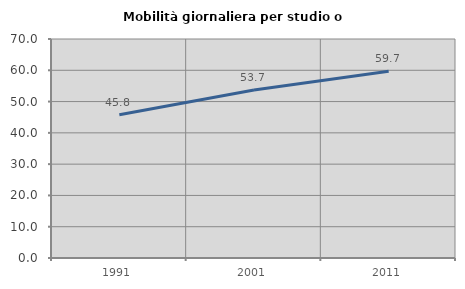
| Category | Mobilità giornaliera per studio o lavoro |
|---|---|
| 1991.0 | 45.787 |
| 2001.0 | 53.682 |
| 2011.0 | 59.716 |